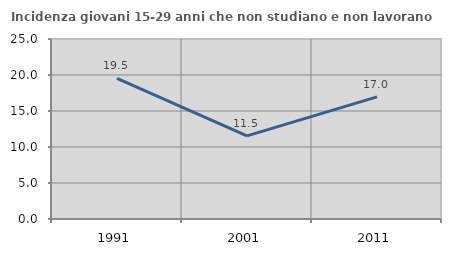
| Category | Incidenza giovani 15-29 anni che non studiano e non lavorano  |
|---|---|
| 1991.0 | 19.54 |
| 2001.0 | 11.55 |
| 2011.0 | 16.964 |